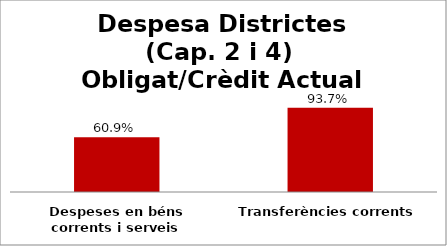
| Category | Series 0 |
|---|---|
| Despeses en béns corrents i serveis | 0.609 |
| Transferències corrents | 0.937 |